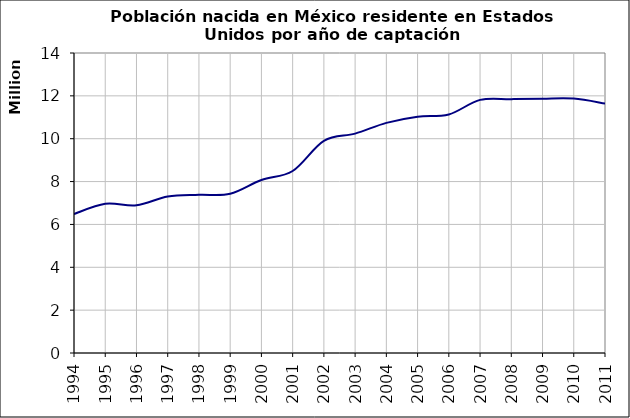
| Category | Habitantes en EU nacidos en México |
|---|---|
| 1994.0 | 6485252.69 |
| 1995.0 | 6960894.94 |
| 1996.0 | 6894787.8 |
| 1997.0 | 7298244.25 |
| 1998.0 | 7382352.3 |
| 1999.0 | 7429126.55 |
| 2000.0 | 8072288.08 |
| 2001.0 | 8494016 |
| 2002.0 | 9900414 |
| 2003.0 | 10237189 |
| 2004.0 | 10739692 |
| 2005.0 | 11026774 |
| 2006.0 | 11132120.8 |
| 2007.0 | 11811731.77 |
| 2008.0 | 11845293.67 |
| 2009.0 | 11869486.75 |
| 2010.0 | 11872688.85 |
| 2011.0 | 11644423 |